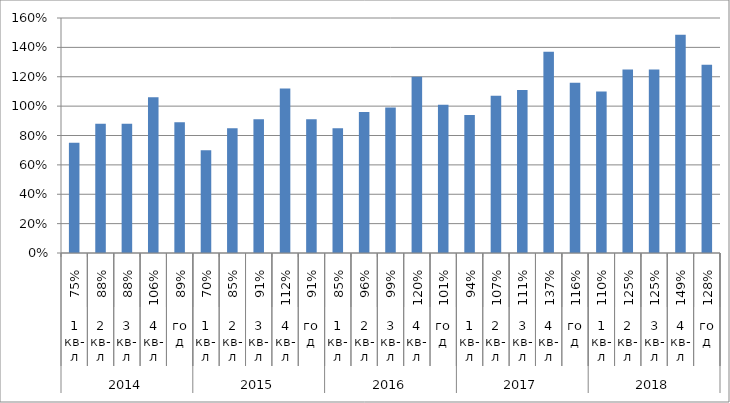
| Category | Series 0 |
|---|---|
| 0 | 0.75 |
| 1 | 0.88 |
| 2 | 0.88 |
| 3 | 1.06 |
| 4 | 0.89 |
| 5 | 0.7 |
| 6 | 0.85 |
| 7 | 0.91 |
| 8 | 1.12 |
| 9 | 0.91 |
| 10 | 0.85 |
| 11 | 0.96 |
| 12 | 0.99 |
| 13 | 1.2 |
| 14 | 1.01 |
| 15 | 0.94 |
| 16 | 1.07 |
| 17 | 1.11 |
| 18 | 1.37 |
| 19 | 1.16 |
| 20 | 1.099 |
| 21 | 1.249 |
| 22 | 1.249 |
| 23 | 1.487 |
| 24 | 1.281 |